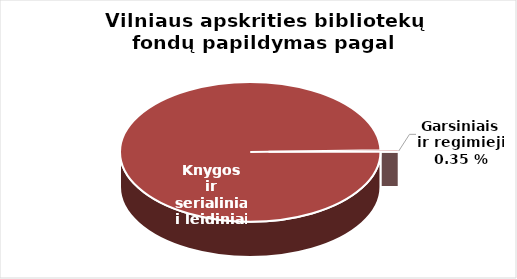
| Category | Series 0 |
|---|---|
| Knygos ir  | 130121 |
| Garsiniai ir regimieji | 462 |